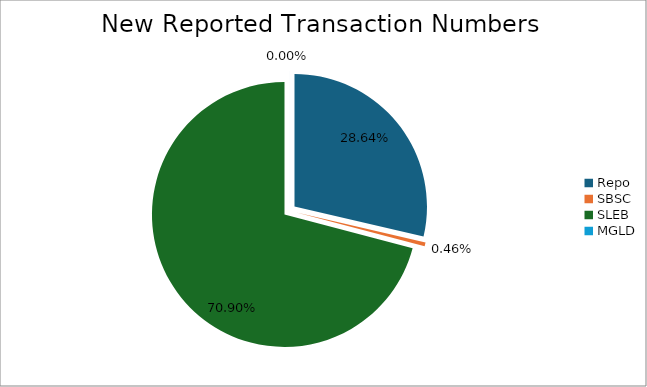
| Category | Series 0 |
|---|---|
| Repo | 310441 |
| SBSC | 4968 |
| SLEB | 768379 |
| MGLD | 14 |